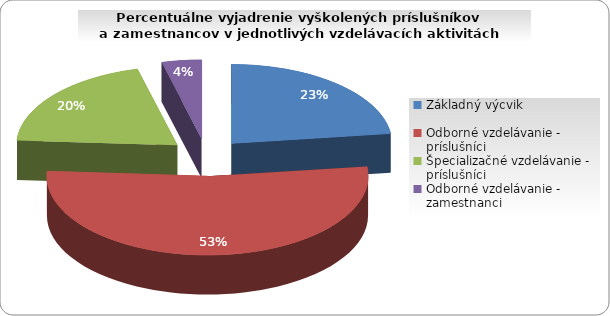
| Category | Series 0 |
|---|---|
| Základný výcvik | 23 |
| Odborné vzdelávanie - príslušníci | 53 |
| Špecializačné vzdelávanie - príslušníci | 20 |
| Odborné vzdelávanie - zamestnanci | 4 |